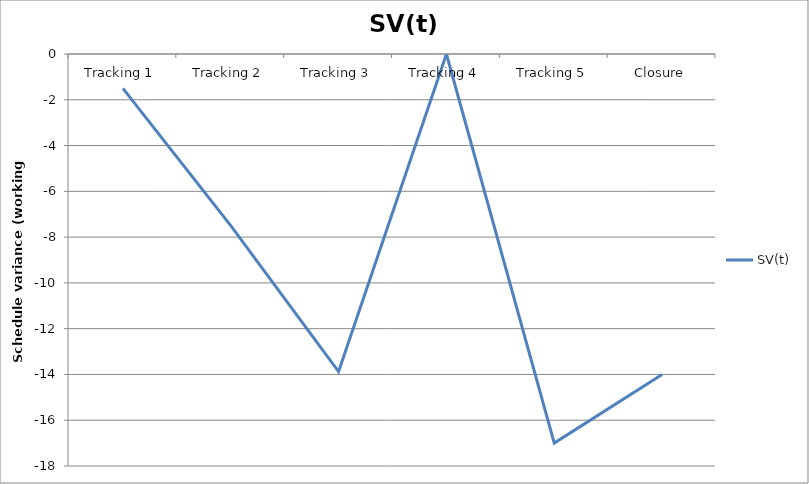
| Category | SV(t) |
|---|---|
| Tracking 1 | -1.5 |
| Tracking 2 | -7.5 |
| Tracking 3 | -13.875 |
| Tracking 4 | 0 |
| Tracking 5 | -17 |
| Closure | -14 |